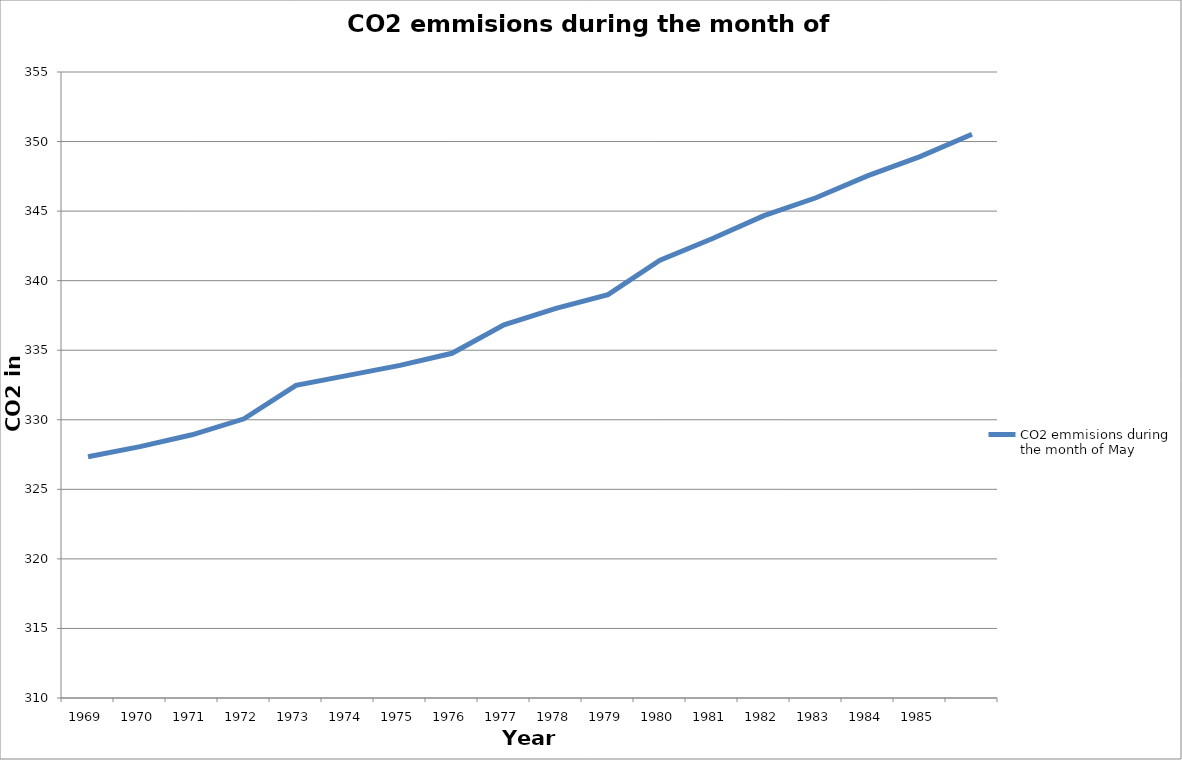
| Category | CO2 emmisions during the month of May |
|---|---|
| 0 | 327.34 |
| 1 | 328.07 |
| 2 | 328.92 |
| 3 | 330.07 |
| 4 | 332.48 |
| 5 | 333.19 |
| 6 | 333.91 |
| 7 | 334.78 |
| 8 | 336.82 |
| 9 | 338.01 |
| 10 | 339 |
| 11 | 341.47 |
| 12 | 343.01 |
| 13 | 344.67 |
| 14 | 345.96 |
| 15 | 347.55 |
| 16 | 348.92 |
| 17 | 350.53 |